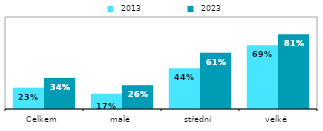
| Category |  2013 |  2023 |
|---|---|---|
| Celkem | 0.232 | 0.338 |
| malé | 0.166 | 0.259 |
| střední | 0.442 | 0.611 |
| velké | 0.694 | 0.813 |